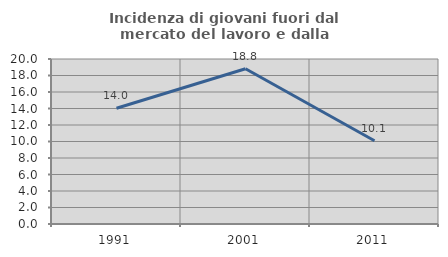
| Category | Incidenza di giovani fuori dal mercato del lavoro e dalla formazione  |
|---|---|
| 1991.0 | 14.028 |
| 2001.0 | 18.822 |
| 2011.0 | 10.092 |